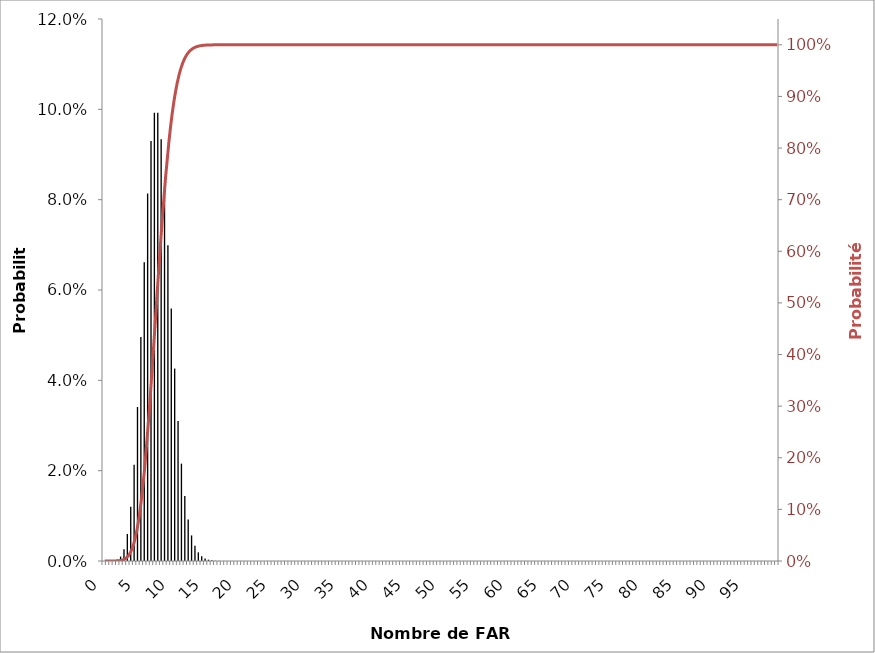
| Category | Probabilité |
|---|---|
| 0.0 | 0 |
| 0.5 | 0 |
| 1.0 | 0 |
| 1.5 | 0 |
| 2.0 | 0 |
| 2.5 | 0.001 |
| 3.0 | 0.003 |
| 3.5 | 0.006 |
| 4.0 | 0.012 |
| 4.5 | 0.021 |
| 5.0 | 0.034 |
| 5.5 | 0.05 |
| 6.0 | 0.066 |
| 6.5 | 0.081 |
| 7.0 | 0.093 |
| 7.5 | 0.099 |
| 8.0 | 0.099 |
| 8.5 | 0.093 |
| 9.0 | 0.083 |
| 9.5 | 0.07 |
| 10.0 | 0.056 |
| 10.5 | 0.043 |
| 11.0 | 0.031 |
| 11.5 | 0.022 |
| 12.0 | 0.014 |
| 12.5 | 0.009 |
| 13.0 | 0.006 |
| 13.5 | 0.003 |
| 14.0 | 0.002 |
| 14.5 | 0.001 |
| 15.0 | 0.001 |
| 15.5 | 0 |
| 16.0 | 0 |
| 16.5 | 0 |
| 17.0 | 0 |
| 17.5 | 0 |
| 18.0 | 0 |
| 18.5 | 0 |
| 19.0 | 0 |
| 19.5 | 0 |
| 20.0 | 0 |
| 20.5 | 0 |
| 21.0 | 0 |
| 21.5 | 0 |
| 22.0 | 0 |
| 22.5 | 0 |
| 23.0 | 0 |
| 23.5 | 0 |
| 24.0 | 0 |
| 24.5 | 0 |
| 25.0 | 0 |
| 25.5 | 0 |
| 26.0 | 0 |
| 26.5 | 0 |
| 27.0 | 0 |
| 27.5 | 0 |
| 28.0 | 0 |
| 28.5 | 0 |
| 29.0 | 0 |
| 29.5 | 0 |
| 30.0 | 0 |
| 30.5 | 0 |
| 31.0 | 0 |
| 31.5 | 0 |
| 32.0 | 0 |
| 32.5 | 0 |
| 33.0 | 0 |
| 33.5 | 0 |
| 34.0 | 0 |
| 34.5 | 0 |
| 35.0 | 0 |
| 35.5 | 0 |
| 36.0 | 0 |
| 36.5 | 0 |
| 37.0 | 0 |
| 37.5 | 0 |
| 38.0 | 0 |
| 38.5 | 0 |
| 39.0 | 0 |
| 39.5 | 0 |
| 40.0 | 0 |
| 40.5 | 0 |
| 41.0 | 0 |
| 41.5 | 0 |
| 42.0 | 0 |
| 42.5 | 0 |
| 43.0 | 0 |
| 43.5 | 0 |
| 44.0 | 0 |
| 44.5 | 0 |
| 45.0 | 0 |
| 45.5 | 0 |
| 46.0 | 0 |
| 46.5 | 0 |
| 47.0 | 0 |
| 47.5 | 0 |
| 48.0 | 0 |
| 48.5 | 0 |
| 49.0 | 0 |
| 49.5 | 0 |
| 50.0 | 0 |
| 50.5 | 0 |
| 51.0 | 0 |
| 51.5 | 0 |
| 52.0 | 0 |
| 52.5 | 0 |
| 53.0 | 0 |
| 53.5 | 0 |
| 54.0 | 0 |
| 54.5 | 0 |
| 55.0 | 0 |
| 55.5 | 0 |
| 56.0 | 0 |
| 56.5 | 0 |
| 57.0 | 0 |
| 57.5 | 0 |
| 58.0 | 0 |
| 58.5 | 0 |
| 59.0 | 0 |
| 59.5 | 0 |
| 60.0 | 0 |
| 60.5 | 0 |
| 61.0 | 0 |
| 61.5 | 0 |
| 62.0 | 0 |
| 62.5 | 0 |
| 63.0 | 0 |
| 63.5 | 0 |
| 64.0 | 0 |
| 64.5 | 0 |
| 65.0 | 0 |
| 65.5 | 0 |
| 66.0 | 0 |
| 66.5 | 0 |
| 67.0 | 0 |
| 67.5 | 0 |
| 68.0 | 0 |
| 68.5 | 0 |
| 69.0 | 0 |
| 69.5 | 0 |
| 70.0 | 0 |
| 70.5 | 0 |
| 71.0 | 0 |
| 71.5 | 0 |
| 72.0 | 0 |
| 72.5 | 0 |
| 73.0 | 0 |
| 73.5 | 0 |
| 74.0 | 0 |
| 74.5 | 0 |
| 75.0 | 0 |
| 75.5 | 0 |
| 76.0 | 0 |
| 76.5 | 0 |
| 77.0 | 0 |
| 77.5 | 0 |
| 78.0 | 0 |
| 78.5 | 0 |
| 79.0 | 0 |
| 79.5 | 0 |
| 80.0 | 0 |
| 80.5 | 0 |
| 81.0 | 0 |
| 81.5 | 0 |
| 82.0 | 0 |
| 82.5 | 0 |
| 83.0 | 0 |
| 83.5 | 0 |
| 84.0 | 0 |
| 84.5 | 0 |
| 85.0 | 0 |
| 85.5 | 0 |
| 86.0 | 0 |
| 86.5 | 0 |
| 87.0 | 0 |
| 87.5 | 0 |
| 88.0 | 0 |
| 88.5 | 0 |
| 89.0 | 0 |
| 89.5 | 0 |
| 90.0 | 0 |
| 90.5 | 0 |
| 91.0 | 0 |
| 91.5 | 0 |
| 92.0 | 0 |
| 92.5 | 0 |
| 93.0 | 0 |
| 93.5 | 0 |
| 94.0 | 0 |
| 94.5 | 0 |
| 95.0 | 0 |
| 95.5 | 0 |
| 96.0 | 0 |
| 96.5 | 0 |
| 97.0 | 0 |
| 97.5 | 0 |
| 98.0 | 0 |
| 98.5 | 0 |
| 99.0 | 0 |
| 99.5 | 0 |